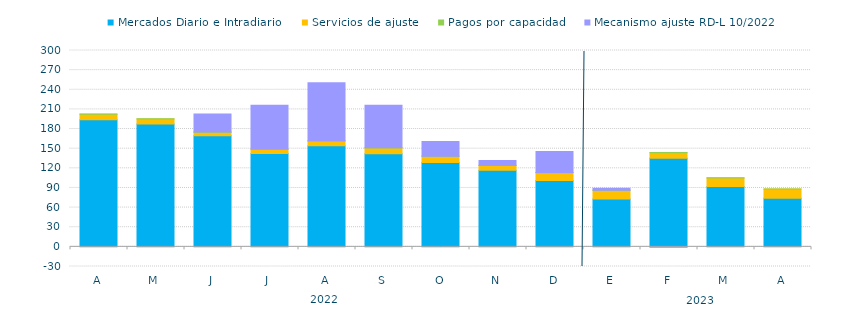
| Category | Mercados Diario e Intradiario  | Servicios de ajuste | Pagos por capacidad | Mecanismo ajuste RD-L 10/2022 |
|---|---|---|---|---|
| A | 194.19 | 8.6 | 0.24 | 0 |
| M | 187.7 | 7.82 | 0.23 | 0 |
| J | 169.63 | 5.43 | 0.26 | 27.52 |
| J | 142.79 | 6.39 | 0.44 | 66.88 |
| A | 154.49 | 7.22 | 0.26 | 88.84 |
| S | 142.09 | 9.09 | 0.26 | 64.99 |
| O | 128.7 | 9.63 | 0.21 | 22.46 |
| N | 117.13 | 7.28 | 0.31 | 7.12 |
| D | 101.21 | 12 | 0.43 | 32.1 |
| E | 73.11 | 13.21 | 0.34 | 2.9 |
| F | 135.43 | 8.36 | 0.35 | -0.71 |
| M | 92.21 | 12.97 | 0.24 | 0 |
| A | 74.42 | 13.82 | 0.17 | 0 |